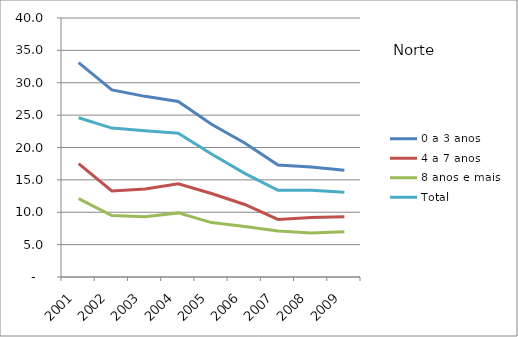
| Category | 0 a 3 anos | 4 a 7 anos | 8 anos e mais | Total |
|---|---|---|---|---|
| 2001.0 | 33.1 | 17.5 | 12.1 | 24.6 |
| 2002.0 | 28.9 | 13.3 | 9.5 | 23 |
| 2003.0 | 27.9 | 13.6 | 9.3 | 22.6 |
| 2004.0 | 27.1 | 14.4 | 9.9 | 22.2 |
| 2005.0 | 23.6 | 12.9 | 8.4 | 19 |
| 2006.0 | 20.7 | 11.2 | 7.8 | 16 |
| 2007.0 | 17.3 | 8.9 | 7.1 | 13.4 |
| 2008.0 | 17 | 9.2 | 6.8 | 13.4 |
| 2009.0 | 16.5 | 9.3 | 7 | 13.1 |